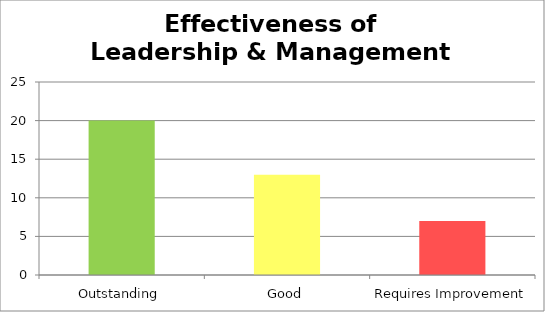
| Category | Series 0 |
|---|---|
| 0 | 20 |
| 1 | 13 |
| 2 | 7 |